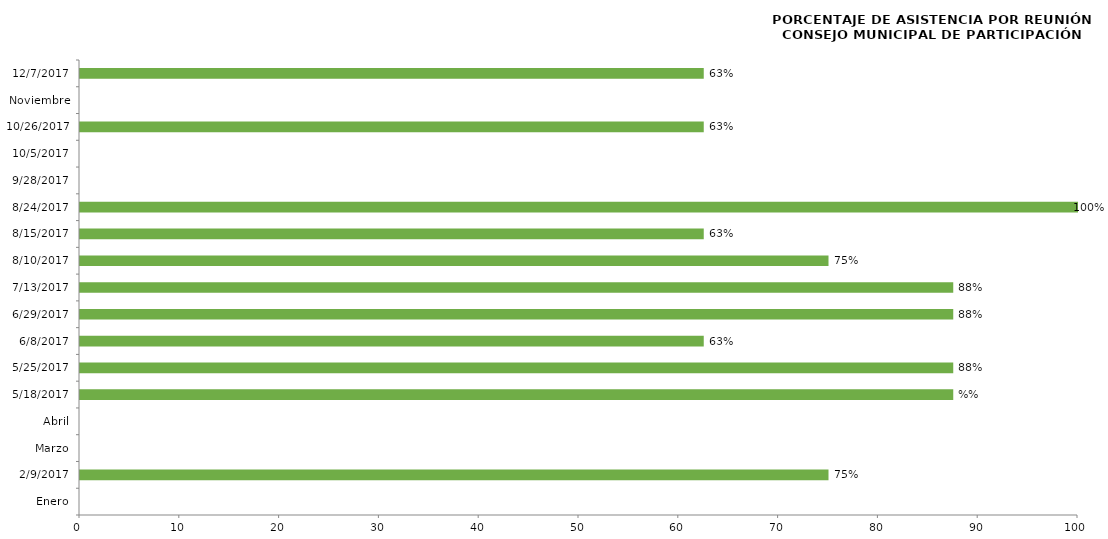
| Category | Series 0 |
|---|---|
| Enero | 0 |
| 09/02/2017 | 75 |
| Marzo | 0 |
| Abril | 0 |
| 18/05/2017 | 87.5 |
| 25/05/2017 | 87.5 |
| 08/06/2017 | 62.5 |
| 29/06/2017 | 87.5 |
| 13/07/2017 | 87.5 |
| 10/08/2017 | 75 |
| 15/08/2017 | 62.5 |
| 24/08/2017 | 100 |
| 28/09/2017 | 0 |
| 05/10/2017 | 0 |
| 26/10/2017 | 62.5 |
| Noviembre | 0 |
| 07/12/2017 | 62.5 |